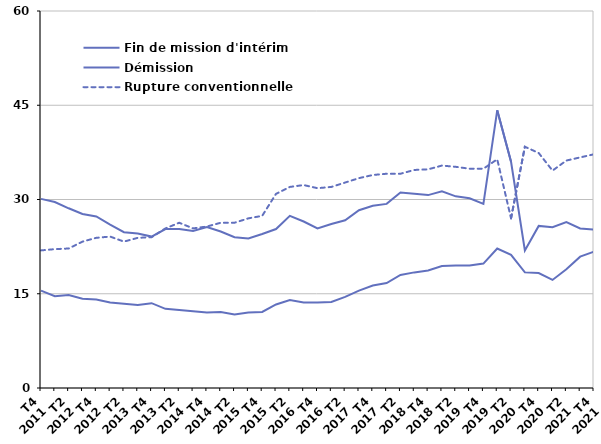
| Category | Fin de mission d'intérim | Démission | Rupture conventionnelle |
|---|---|---|---|
| T4
2011 | 30.1 | 15.5 | 21.9 |
| T1
2012 | 29.6 | 14.6 | 22.1 |
| T2
2012 | 28.6 | 14.8 | 22.2 |
| T3
2012 | 27.7 | 14.2 | 23.3 |
| T4
2012 | 27.3 | 14.1 | 23.9 |
| T1
2013 | 26 | 13.6 | 24.1 |
| T2
2013 | 24.8 | 13.4 | 23.3 |
| T3
2013 | 24.6 | 13.2 | 23.9 |
| T4
2013 | 24.1 | 13.5 | 24 |
| T1
2014 | 25.3 | 12.6 | 25.4 |
| T2
2014 | 25.3 | 12.4 | 26.3 |
| T3
2014 | 25 | 12.2 | 25.4 |
| T4
2014 | 25.6 | 12 | 25.7 |
| T1
2015 | 24.9 | 12.1 | 26.3 |
| T2
2015 | 24 | 11.7 | 26.3 |
| T3
2015 | 23.8 | 12 | 27 |
| T4
2015 | 24.5 | 12.1 | 27.4 |
| T1
2016 | 25.3 | 13.3 | 30.9 |
| T2
2016 | 27.4 | 14 | 32 |
| T3
2016 | 26.5 | 13.6 | 32.3 |
| T4
2016 | 25.4 | 13.6 | 31.8 |
| T1
2017 | 26.1 | 13.7 | 32 |
| T2
2017 | 26.7 | 14.5 | 32.7 |
| T3
2017 | 28.3 | 15.5 | 33.4 |
| T4
2017 | 29 | 16.3 | 33.9 |
| T1
2018 | 29.3 | 16.7 | 34.1 |
| T2
2018 | 31.1 | 18 | 34.1 |
| T3
2018 | 30.9 | 18.4 | 34.7 |
| T4
2018 | 30.7 | 18.7 | 34.8 |
| T1
2019 | 31.3 | 19.4 | 35.4 |
| T2
2019 | 30.5 | 19.5 | 35.2 |
| T3
2019 | 30.2 | 19.5 | 34.9 |
| T4
2019 | 29.3 | 19.8 | 34.9 |
| T1
2020 | 44.2 | 22.2 | 36.4 |
| T2
2020 | 36 | 21.2 | 27 |
| T3
2020 | 21.9 | 18.4 | 38.4 |
| T4
2020 | 25.8 | 18.3 | 37.4 |
| T1
2021 | 25.6 | 17.2 | 34.6 |
| T2
2021 | 26.4 | 18.9 | 36.2 |
| T3
2021 | 25.4 | 20.9 | 36.7 |
| T4
2021 | 25.2 | 21.7 | 37.2 |